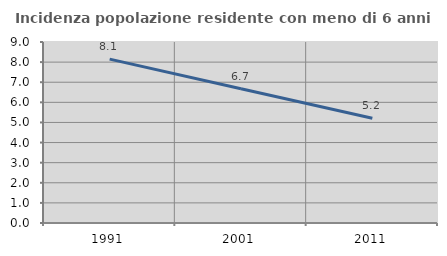
| Category | Incidenza popolazione residente con meno di 6 anni |
|---|---|
| 1991.0 | 8.147 |
| 2001.0 | 6.672 |
| 2011.0 | 5.207 |